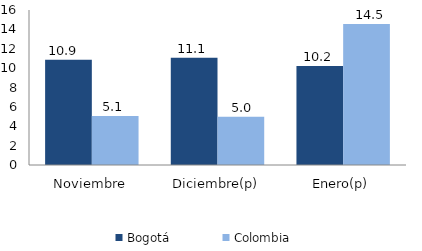
| Category | Bogotá | Colombia |
|---|---|---|
| Noviembre | 10.863 | 5.057 |
| Diciembre(p) | 11.073 | 4.982 |
| Enero(p) | 10.209 | 14.545 |